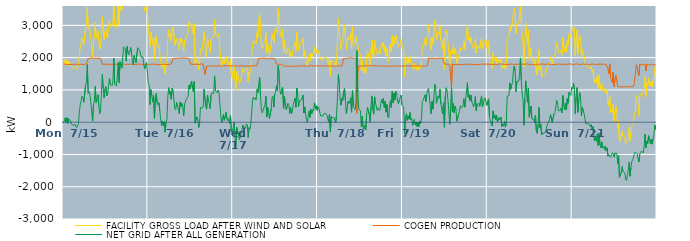
| Category | FACILITY GROSS LOAD AFTER WIND AND SOLAR | COGEN PRODUCTION | NET GRID AFTER ALL GENERATION |
|---|---|---|---|
|  Mon  7/15 | 1766 | 1784 | -18 |
|  Mon  7/15 | 1813 | 1775 | 38 |
|  Mon  7/15 | 1938 | 1803 | 135 |
|  Mon  7/15 | 1782 | 1786 | -4 |
|  Mon  7/15 | 1925 | 1787 | 138 |
|  Mon  7/15 | 1763 | 1802 | -39 |
|  Mon  7/15 | 1895 | 1787 | 108 |
|  Mon  7/15 | 1900 | 1795 | 105 |
|  Mon  7/15 | 1825 | 1789 | 36 |
|  Mon  7/15 | 1742 | 1795 | -53 |
|  Mon  7/15 | 1699 | 1786 | -87 |
|  Mon  7/15 | 1700 | 1796 | -96 |
|  Mon  7/15 | 1693 | 1794 | -101 |
|  Mon  7/15 | 1728 | 1790 | -62 |
|  Mon  7/15 | 1674 | 1797 | -123 |
|  Mon  7/15 | 1626 | 1794 | -168 |
|  Mon  7/15 | 1621 | 1794 | -173 |
|  Mon  7/15 | 1755 | 1796 | -41 |
|  Mon  7/15 | 2092 | 1789 | 303 |
|  Mon  7/15 | 2328 | 1789 | 539 |
|  Mon  7/15 | 2456 | 1795 | 661 |
|  Mon  7/15 | 2601 | 1796 | 805 |
|  Mon  7/15 | 2543 | 1783 | 760 |
|  Mon  7/15 | 2413 | 1793 | 620 |
|  Mon  7/15 | 2430 | 1791 | 639 |
|  Mon  7/15 | 2916 | 1794 | 1122 |
|  Mon  7/15 | 3054 | 1803 | 1251 |
|  Mon  7/15 | 3571 | 1788 | 1783 |
|  Mon  7/15 | 2874 | 1978 | 896 |
|  Mon  7/15 | 2916 | 1974 | 942 |
|  Mon  7/15 | 2829 | 1966 | 863 |
|  Mon  7/15 | 2591 | 1985 | 606 |
|  Mon  7/15 | 2612 | 2004 | 608 |
|  Mon  7/15 | 2009 | 1977 | 32 |
|  Mon  7/15 | 2493 | 1968 | 525 |
|  Mon  7/15 | 2640 | 1972 | 668 |
|  Mon  7/15 | 3095 | 1987 | 1108 |
|  Mon  7/15 | 2599 | 1993 | 606 |
|  Mon  7/15 | 2676 | 1976 | 700 |
|  Mon  7/15 | 2835 | 1985 | 850 |
|  Mon  7/15 | 2508 | 1988 | 520 |
|  Mon  7/15 | 2251 | 1986 | 265 |
|  Mon  7/15 | 2375 | 1973 | 402 |
|  Mon  7/15 | 2881 | 1979 | 902 |
|  Mon  7/15 | 3268 | 1789 | 1479 |
|  Mon  7/15 | 2840 | 1800 | 1040 |
|  Mon  7/15 | 2558 | 1802 | 756 |
|  Mon  7/15 | 2809 | 1787 | 1022 |
|  Mon  7/15 | 2895 | 1789 | 1106 |
|  Mon  7/15 | 2612 | 1795 | 817 |
|  Mon  7/15 | 2690 | 1800 | 890 |
|  Mon  7/15 | 2885 | 1790 | 1095 |
|  Mon  7/15 | 3147 | 1792 | 1355 |
|  Mon  7/15 | 2975 | 1796 | 1179 |
|  Mon  7/15 | 2943 | 1788 | 1155 |
|  Mon  7/15 | 2915 | 1791 | 1124 |
|  Mon  7/15 | 3077 | 1795 | 1282 |
|  Mon  7/15 | 3769 | 1787 | 1982 |
|  Mon  7/15 | 2966 | 1792 | 1174 |
|  Mon  7/15 | 2983 | 1811 | 1172 |
|  Mon  7/15 | 2917 | 1791 | 1126 |
|  Mon  7/15 | 3194 | 1793 | 1401 |
|  Mon  7/15 | 3647 | 1798 | 1849 |
|  Mon  7/15 | 3016 | 1789 | 1227 |
|  Mon  7/15 | 3664 | 1794 | 1870 |
|  Mon  7/15 | 3648 | 1791 | 1857 |
|  Mon  7/15 | 3465 | 1790 | 1675 |
|  Mon  7/15 | 3771 | 1784 | 1987 |
|  Mon  7/15 | 4131 | 1800 | 2331 |
|  Mon  7/15 | 4142 | 1794 | 2348 |
|  Mon  7/15 | 4055 | 1787 | 2268 |
|  Mon  7/15 | 3684 | 1790 | 1894 |
|  Mon  7/15 | 4146 | 1799 | 2347 |
|  Mon  7/15 | 3955 | 1810 | 2145 |
|  Mon  7/15 | 3883 | 1792 | 2091 |
|  Mon  7/15 | 3961 | 1788 | 2173 |
|  Mon  7/15 | 4106 | 1794 | 2312 |
|  Mon  7/15 | 3938 | 1790 | 2148 |
|  Mon  7/15 | 3660 | 1791 | 1869 |
|  Mon  7/15 | 3564 | 1786 | 1778 |
|  Mon  7/15 | 3859 | 1790 | 2069 |
|  Mon  7/15 | 3752 | 1789 | 1963 |
|  Mon  7/15 | 3623 | 1782 | 1841 |
|  Mon  7/15 | 3669 | 1801 | 1868 |
|  Mon  7/15 | 4108 | 1803 | 2305 |
|  Mon  7/15 | 4059 | 1791 | 2268 |
|  Mon  7/15 | 4035 | 1799 | 2236 |
|  Mon  7/15 | 3950 | 1793 | 2157 |
|  Mon  7/15 | 3795 | 1795 | 2000 |
|  Mon  7/15 | 3766 | 1792 | 1974 |
|  Mon  7/15 | 3806 | 1784 | 2022 |
|  Mon  7/15 | 3551 | 1789 | 1762 |
|  Mon  7/15 | 3447 | 1787 | 1660 |
|  Mon  7/15 | 3581 | 1792 | 1789 |
|  Mon  7/15 | 3641 | 1796 | 1845 |
|  Mon  7/15 | 3314 | 1782 | 1532 |
|  Tue  7/16 | 2977 | 1790 | 1187 |
|  Tue  7/16 | 2950 | 1796 | 1154 |
|  Tue  7/16 | 2335 | 1787 | 548 |
|  Tue  7/16 | 2791 | 1781 | 1010 |
|  Tue  7/16 | 2622 | 1802 | 820 |
|  Tue  7/16 | 2415 | 1789 | 626 |
|  Tue  7/16 | 2617 | 1791 | 826 |
|  Tue  7/16 | 1901 | 1792 | 109 |
|  Tue  7/16 | 2542 | 1798 | 744 |
|  Tue  7/16 | 2667 | 1779 | 888 |
|  Tue  7/16 | 2376 | 1785 | 591 |
|  Tue  7/16 | 2325 | 1788 | 537 |
|  Tue  7/16 | 2386 | 1782 | 604 |
|  Tue  7/16 | 2131 | 1786 | 345 |
|  Tue  7/16 | 1881 | 1785 | 96 |
|  Tue  7/16 | 1687 | 1800 | -113 |
|  Tue  7/16 | 1833 | 1794 | 39 |
|  Tue  7/16 | 1694 | 1797 | -103 |
|  Tue  7/16 | 1805 | 1791 | 14 |
|  Tue  7/16 | 1493 | 1803 | -310 |
|  Tue  7/16 | 1767 | 1792 | -25 |
|  Tue  7/16 | 1878 | 1785 | 93 |
|  Tue  7/16 | 2525 | 1783 | 742 |
|  Tue  7/16 | 2865 | 1795 | 1070 |
|  Tue  7/16 | 2663 | 1794 | 869 |
|  Tue  7/16 | 2737 | 1779 | 958 |
|  Tue  7/16 | 2514 | 1802 | 712 |
|  Tue  7/16 | 2850 | 1798 | 1052 |
|  Tue  7/16 | 2941 | 1974 | 967 |
|  Tue  7/16 | 2968 | 1987 | 981 |
|  Tue  7/16 | 2394 | 1976 | 418 |
|  Tue  7/16 | 2368 | 1987 | 381 |
|  Tue  7/16 | 2595 | 1983 | 612 |
|  Tue  7/16 | 2458 | 1984 | 474 |
|  Tue  7/16 | 2424 | 1982 | 442 |
|  Tue  7/16 | 2248 | 1985 | 263 |
|  Tue  7/16 | 2610 | 1984 | 626 |
|  Tue  7/16 | 2456 | 1973 | 483 |
|  Tue  7/16 | 2573 | 1985 | 588 |
|  Tue  7/16 | 2491 | 1990 | 501 |
|  Tue  7/16 | 2193 | 1999 | 194 |
|  Tue  7/16 | 2540 | 1988 | 552 |
|  Tue  7/16 | 2506 | 1981 | 525 |
|  Tue  7/16 | 2691 | 1981 | 710 |
|  Tue  7/16 | 2709 | 1985 | 724 |
|  Tue  7/16 | 2770 | 1981 | 789 |
|  Tue  7/16 | 3119 | 1966 | 1153 |
|  Tue  7/16 | 2996 | 1975 | 1021 |
|  Tue  7/16 | 2995 | 1797 | 1198 |
|  Tue  7/16 | 3059 | 1788 | 1271 |
|  Tue  7/16 | 2838 | 1794 | 1044 |
|  Tue  7/16 | 2726 | 1783 | 943 |
|  Tue  7/16 | 3051 | 1790 | 1261 |
|  Tue  7/16 | 1751 | 1785 | -34 |
|  Tue  7/16 | 1770 | 1797 | -27 |
|  Tue  7/16 | 1965 | 1801 | 164 |
|  Tue  7/16 | 1888 | 1795 | 93 |
|  Tue  7/16 | 1621 | 1791 | -170 |
|  Tue  7/16 | 1750 | 1786 | -36 |
|  Tue  7/16 | 2253 | 1787 | 466 |
|  Tue  7/16 | 2237 | 1805 | 432 |
|  Tue  7/16 | 2241 | 1800 | 441 |
|  Tue  7/16 | 2260 | 1802 | 458 |
|  Tue  7/16 | 2804 | 1782 | 1022 |
|  Tue  7/16 | 2493 | 1482 | 1011 |
|  Tue  7/16 | 2012 | 1511 | 501 |
|  Tue  7/16 | 2140 | 1738 | 402 |
|  Tue  7/16 | 2583 | 1742 | 841 |
|  Tue  7/16 | 2374 | 1738 | 636 |
|  Tue  7/16 | 2318 | 1744 | 574 |
|  Tue  7/16 | 2162 | 1743 | 419 |
|  Tue  7/16 | 2572 | 1739 | 833 |
|  Tue  7/16 | 2656 | 1742 | 914 |
|  Tue  7/16 | 2649 | 1746 | 903 |
|  Tue  7/16 | 2640 | 1746 | 894 |
|  Tue  7/16 | 3179 | 1744 | 1435 |
|  Tue  7/16 | 2703 | 1735 | 968 |
|  Tue  7/16 | 2710 | 1749 | 961 |
|  Tue  7/16 | 2640 | 1725 | 915 |
|  Tue  7/16 | 2756 | 1757 | 999 |
|  Tue  7/16 | 2660 | 1746 | 914 |
|  Tue  7/16 | 2675 | 1740 | 935 |
|  Tue  7/16 | 1937 | 1735 | 202 |
|  Tue  7/16 | 1720 | 1737 | -17 |
|  Tue  7/16 | 1875 | 1754 | 121 |
|  Tue  7/16 | 1987 | 1747 | 240 |
|  Tue  7/16 | 1804 | 1746 | 58 |
|  Tue  7/16 | 1941 | 1746 | 195 |
|  Tue  7/16 | 2047 | 1742 | 305 |
|  Tue  7/16 | 1846 | 1749 | 97 |
|  Tue  7/16 | 1776 | 1737 | 39 |
|  Tue  7/16 | 1859 | 1755 | 104 |
|  Tue  7/16 | 1693 | 1744 | -51 |
|  Tue  7/16 | 1943 | 1741 | 202 |
|  Tue  7/16 | 1469 | 1744 | -275 |
|  Tue  7/16 | 1357 | 1739 | -382 |
|  Wed  7/17 | 1561 | 1743 | -182 |
|  Wed  7/17 | 1752 | 1747 | 5 |
|  Wed  7/17 | 1318 | 1739 | -421 |
|  Wed  7/17 | 970 | 1740 | -770 |
|  Wed  7/17 | 1583 | 1742 | -159 |
|  Wed  7/17 | 1568 | 1751 | -183 |
|  Wed  7/17 | 1350 | 1742 | -392 |
|  Wed  7/17 | 1203 | 1736 | -533 |
|  Wed  7/17 | 1237 | 1750 | -513 |
|  Wed  7/17 | 1385 | 1747 | -362 |
|  Wed  7/17 | 1518 | 1740 | -222 |
|  Wed  7/17 | 1660 | 1749 | -89 |
|  Wed  7/17 | 1540 | 1740 | -200 |
|  Wed  7/17 | 1571 | 1729 | -158 |
|  Wed  7/17 | 1557 | 1746 | -189 |
|  Wed  7/17 | 1690 | 1744 | -54 |
|  Wed  7/17 | 1653 | 1738 | -85 |
|  Wed  7/17 | 1261 | 1735 | -474 |
|  Wed  7/17 | 1566 | 1733 | -167 |
|  Wed  7/17 | 1522 | 1736 | -214 |
|  Wed  7/17 | 1701 | 1751 | -50 |
|  Wed  7/17 | 1715 | 1748 | -33 |
|  Wed  7/17 | 2433 | 1748 | 685 |
|  Wed  7/17 | 2527 | 1752 | 775 |
|  Wed  7/17 | 2460 | 1748 | 712 |
|  Wed  7/17 | 2502 | 1749 | 753 |
|  Wed  7/17 | 2425 | 1729 | 696 |
|  Wed  7/17 | 2768 | 1754 | 1014 |
|  Wed  7/17 | 2653 | 1736 | 917 |
|  Wed  7/17 | 3159 | 1980 | 1179 |
|  Wed  7/17 | 3365 | 1975 | 1390 |
|  Wed  7/17 | 2770 | 1981 | 789 |
|  Wed  7/17 | 2339 | 1983 | 356 |
|  Wed  7/17 | 2268 | 1979 | 289 |
|  Wed  7/17 | 2290 | 1987 | 303 |
|  Wed  7/17 | 2458 | 1990 | 468 |
|  Wed  7/17 | 2504 | 1979 | 525 |
|  Wed  7/17 | 2778 | 1969 | 809 |
|  Wed  7/17 | 2141 | 1983 | 158 |
|  Wed  7/17 | 2424 | 1968 | 456 |
|  Wed  7/17 | 2333 | 1994 | 339 |
|  Wed  7/17 | 2091 | 1980 | 111 |
|  Wed  7/17 | 2092 | 1978 | 114 |
|  Wed  7/17 | 2390 | 1982 | 408 |
|  Wed  7/17 | 2753 | 1991 | 762 |
|  Wed  7/17 | 2781 | 1973 | 808 |
|  Wed  7/17 | 2451 | 1985 | 466 |
|  Wed  7/17 | 2849 | 1975 | 874 |
|  Wed  7/17 | 2890 | 1970 | 920 |
|  Wed  7/17 | 2927 | 1799 | 1128 |
|  Wed  7/17 | 2751 | 1782 | 969 |
|  Wed  7/17 | 3545 | 1795 | 1750 |
|  Wed  7/17 | 3297 | 1804 | 1493 |
|  Wed  7/17 | 2742 | 1795 | 947 |
|  Wed  7/17 | 2658 | 1790 | 868 |
|  Wed  7/17 | 2807 | 1791 | 1016 |
|  Wed  7/17 | 2867 | 1788 | 1079 |
|  Wed  7/17 | 2172 | 1749 | 423 |
|  Wed  7/17 | 2538 | 1737 | 801 |
|  Wed  7/17 | 2247 | 1735 | 512 |
|  Wed  7/17 | 2117 | 1733 | 384 |
|  Wed  7/17 | 2149 | 1737 | 412 |
|  Wed  7/17 | 2317 | 1733 | 584 |
|  Wed  7/17 | 2278 | 1738 | 540 |
|  Wed  7/17 | 2013 | 1743 | 270 |
|  Wed  7/17 | 2187 | 1724 | 463 |
|  Wed  7/17 | 2000 | 1738 | 262 |
|  Wed  7/17 | 2063 | 1736 | 327 |
|  Wed  7/17 | 2307 | 1759 | 548 |
|  Wed  7/17 | 2385 | 1737 | 648 |
|  Wed  7/17 | 2480 | 1740 | 740 |
|  Wed  7/17 | 2196 | 1736 | 460 |
|  Wed  7/17 | 2801 | 1744 | 1057 |
|  Wed  7/17 | 2589 | 1741 | 848 |
|  Wed  7/17 | 2220 | 1736 | 484 |
|  Wed  7/17 | 2399 | 1732 | 667 |
|  Wed  7/17 | 2375 | 1733 | 642 |
|  Wed  7/17 | 2430 | 1739 | 691 |
|  Wed  7/17 | 2488 | 1739 | 749 |
|  Wed  7/17 | 2593 | 1754 | 839 |
|  Wed  7/17 | 2013 | 1729 | 284 |
|  Wed  7/17 | 2216 | 1742 | 474 |
|  Wed  7/17 | 1979 | 1747 | 232 |
|  Wed  7/17 | 1792 | 1734 | 58 |
|  Wed  7/17 | 1735 | 1742 | -7 |
|  Wed  7/17 | 1935 | 1737 | 198 |
|  Wed  7/17 | 2093 | 1743 | 350 |
|  Wed  7/17 | 1892 | 1744 | 148 |
|  Wed  7/17 | 2138 | 1742 | 396 |
|  Wed  7/17 | 2022 | 1755 | 267 |
|  Wed  7/17 | 2130 | 1744 | 386 |
|  Wed  7/17 | 2091 | 1739 | 352 |
|  Wed  7/17 | 2338 | 1739 | 599 |
|  Wed  7/17 | 2157 | 1740 | 417 |
|  Wed  7/17 | 2251 | 1744 | 507 |
|  Wed  7/17 | 2115 | 1749 | 366 |
|  Thu  7/18 | 2224 | 1743 | 481 |
|  Thu  7/18 | 2176 | 1739 | 437 |
|  Thu  7/18 | 2203 | 1750 | 453 |
|  Thu  7/18 | 1934 | 1745 | 189 |
|  Thu  7/18 | 1966 | 1745 | 221 |
|  Thu  7/18 | 1918 | 1739 | 179 |
|  Thu  7/18 | 1904 | 1737 | 167 |
|  Thu  7/18 | 2010 | 1744 | 266 |
|  Thu  7/18 | 2015 | 1730 | 285 |
|  Thu  7/18 | 2008 | 1743 | 265 |
|  Thu  7/18 | 1954 | 1737 | 217 |
|  Thu  7/18 | 1963 | 1749 | 214 |
|  Thu  7/18 | 1739 | 1736 | 3 |
|  Thu  7/18 | 1993 | 1741 | 252 |
|  Thu  7/18 | 1444 | 1750 | -306 |
|  Thu  7/18 | 1919 | 1742 | 177 |
|  Thu  7/18 | 1882 | 1743 | 139 |
|  Thu  7/18 | 1878 | 1738 | 140 |
|  Thu  7/18 | 1894 | 1753 | 141 |
|  Thu  7/18 | 1865 | 1737 | 128 |
|  Thu  7/18 | 1711 | 1734 | -23 |
|  Thu  7/18 | 1962 | 1732 | 230 |
|  Thu  7/18 | 2503 | 1735 | 768 |
|  Thu  7/18 | 3220 | 1747 | 1473 |
|  Thu  7/18 | 2964 | 1753 | 1211 |
|  Thu  7/18 | 2443 | 1740 | 703 |
|  Thu  7/18 | 2258 | 1734 | 524 |
|  Thu  7/18 | 2481 | 1732 | 749 |
|  Thu  7/18 | 2431 | 1756 | 675 |
|  Thu  7/18 | 2947 | 1981 | 966 |
|  Thu  7/18 | 3016 | 1976 | 1040 |
|  Thu  7/18 | 2647 | 1972 | 675 |
|  Thu  7/18 | 2244 | 1979 | 265 |
|  Thu  7/18 | 2431 | 1989 | 442 |
|  Thu  7/18 | 2630 | 1978 | 652 |
|  Thu  7/18 | 2553 | 1973 | 580 |
|  Thu  7/18 | 2614 | 1975 | 639 |
|  Thu  7/18 | 2762 | 2005 | 757 |
|  Thu  7/18 | 2286 | 1978 | 308 |
|  Thu  7/18 | 2974 | 1986 | 988 |
|  Thu  7/18 | 2461 | 1973 | 488 |
|  Thu  7/18 | 2441 | 1982 | 459 |
|  Thu  7/18 | 2367 | 1977 | 390 |
|  Thu  7/18 | 2652 | 1987 | 665 |
|  Thu  7/18 | 2497 | 275 | 2222 |
|  Thu  7/18 | 2425 | 1497 | 928 |
|  Thu  7/18 | 2169 | 1740 | 429 |
|  Thu  7/18 | 2160 | 1740 | 420 |
|  Thu  7/18 | 2096 | 1744 | 352 |
|  Thu  7/18 | 1606 | 1746 | -140 |
|  Thu  7/18 | 1923 | 1733 | 190 |
|  Thu  7/18 | 1591 | 1749 | -158 |
|  Thu  7/18 | 1518 | 1745 | -227 |
|  Thu  7/18 | 1667 | 1752 | -85 |
|  Thu  7/18 | 1511 | 1752 | -241 |
|  Thu  7/18 | 1989 | 1734 | 255 |
|  Thu  7/18 | 2192 | 1736 | 456 |
|  Thu  7/18 | 2173 | 1735 | 438 |
|  Thu  7/18 | 1992 | 1761 | 231 |
|  Thu  7/18 | 1731 | 1731 | 0 |
|  Thu  7/18 | 2252 | 1749 | 503 |
|  Thu  7/18 | 2558 | 1744 | 814 |
|  Thu  7/18 | 2127 | 1744 | 383 |
|  Thu  7/18 | 1997 | 1747 | 250 |
|  Thu  7/18 | 2534 | 1749 | 785 |
|  Thu  7/18 | 2351 | 1750 | 601 |
|  Thu  7/18 | 2356 | 1743 | 613 |
|  Thu  7/18 | 2096 | 1732 | 364 |
|  Thu  7/18 | 2172 | 1730 | 442 |
|  Thu  7/18 | 2204 | 1746 | 458 |
|  Thu  7/18 | 2102 | 1738 | 364 |
|  Thu  7/18 | 2312 | 1731 | 581 |
|  Thu  7/18 | 2450 | 1750 | 700 |
|  Thu  7/18 | 2329 | 1742 | 587 |
|  Thu  7/18 | 2482 | 1741 | 741 |
|  Thu  7/18 | 2189 | 1737 | 452 |
|  Thu  7/18 | 2371 | 1731 | 640 |
|  Thu  7/18 | 2054 | 1746 | 308 |
|  Thu  7/18 | 2281 | 1735 | 546 |
|  Thu  7/18 | 1905 | 1731 | 174 |
|  Thu  7/18 | 1860 | 1735 | 125 |
|  Thu  7/18 | 2297 | 1756 | 541 |
|  Thu  7/18 | 2414 | 1745 | 669 |
|  Thu  7/18 | 2189 | 1736 | 453 |
|  Thu  7/18 | 2691 | 1736 | 955 |
|  Thu  7/18 | 2348 | 1742 | 606 |
|  Thu  7/18 | 2641 | 1738 | 903 |
|  Thu  7/18 | 2425 | 1741 | 684 |
|  Thu  7/18 | 2702 | 1750 | 952 |
|  Thu  7/18 | 2606 | 1745 | 861 |
|  Thu  7/18 | 2393 | 1732 | 661 |
|  Thu  7/18 | 2324 | 1752 | 572 |
|  Thu  7/18 | 2431 | 1734 | 697 |
|  Thu  7/18 | 2398 | 1731 | 667 |
|  Thu  7/18 | 2578 | 1741 | 837 |
|  Thu  7/18 | 2282 | 1747 | 535 |
|  Fri  7/19 | 2246 | 1732 | 514 |
|  Fri  7/19 | 2187 | 1750 | 437 |
|  Fri  7/19 | 1403 | 1746 | -343 |
|  Fri  7/19 | 1895 | 1744 | 151 |
|  Fri  7/19 | 2004 | 1741 | 263 |
|  Fri  7/19 | 1791 | 1733 | 58 |
|  Fri  7/19 | 1947 | 1751 | 196 |
|  Fri  7/19 | 1833 | 1742 | 91 |
|  Fri  7/19 | 2041 | 1743 | 298 |
|  Fri  7/19 | 1829 | 1747 | 82 |
|  Fri  7/19 | 1863 | 1744 | 119 |
|  Fri  7/19 | 1645 | 1745 | -100 |
|  Fri  7/19 | 1772 | 1751 | 21 |
|  Fri  7/19 | 1822 | 1735 | 87 |
|  Fri  7/19 | 1644 | 1734 | -90 |
|  Fri  7/19 | 1749 | 1744 | 5 |
|  Fri  7/19 | 1614 | 1745 | -131 |
|  Fri  7/19 | 1737 | 1741 | -4 |
|  Fri  7/19 | 1613 | 1754 | -141 |
|  Fri  7/19 | 1765 | 1736 | 29 |
|  Fri  7/19 | 1688 | 1734 | -46 |
|  Fri  7/19 | 1858 | 1751 | 107 |
|  Fri  7/19 | 2377 | 1740 | 637 |
|  Fri  7/19 | 2417 | 1737 | 680 |
|  Fri  7/19 | 2382 | 1731 | 651 |
|  Fri  7/19 | 2585 | 1740 | 845 |
|  Fri  7/19 | 2379 | 1742 | 637 |
|  Fri  7/19 | 2599 | 1738 | 861 |
|  Fri  7/19 | 2729 | 1737 | 992 |
|  Fri  7/19 | 3030 | 1988 | 1042 |
|  Fri  7/19 | 2785 | 1974 | 811 |
|  Fri  7/19 | 2445 | 1978 | 467 |
|  Fri  7/19 | 2236 | 1980 | 256 |
|  Fri  7/19 | 2632 | 1986 | 646 |
|  Fri  7/19 | 2406 | 2004 | 402 |
|  Fri  7/19 | 2666 | 1979 | 687 |
|  Fri  7/19 | 3154 | 1976 | 1178 |
|  Fri  7/19 | 3108 | 1965 | 1143 |
|  Fri  7/19 | 2570 | 1988 | 582 |
|  Fri  7/19 | 2750 | 1983 | 767 |
|  Fri  7/19 | 2797 | 1987 | 810 |
|  Fri  7/19 | 2718 | 1981 | 737 |
|  Fri  7/19 | 2990 | 1976 | 1014 |
|  Fri  7/19 | 2543 | 1981 | 562 |
|  Fri  7/19 | 2565 | 1976 | 589 |
|  Fri  7/19 | 2244 | 1982 | 262 |
|  Fri  7/19 | 2598 | 1997 | 601 |
|  Fri  7/19 | 1642 | 1800 | -158 |
|  Fri  7/19 | 2613 | 1796 | 817 |
|  Fri  7/19 | 2864 | 1799 | 1065 |
|  Fri  7/19 | 2741 | 1781 | 960 |
|  Fri  7/19 | 2491 | 1800 | 691 |
|  Fri  7/19 | 2134 | 1792 | 342 |
|  Fri  7/19 | 1735 | 1798 | -63 |
|  Fri  7/19 | 2217 | 1790 | 427 |
|  Fri  7/19 | 2174 | 1091 | 1083 |
|  Fri  7/19 | 2115 | 1790 | 325 |
|  Fri  7/19 | 2378 | 1800 | 578 |
|  Fri  7/19 | 2086 | 1794 | 292 |
|  Fri  7/19 | 2282 | 1785 | 497 |
|  Fri  7/19 | 2206 | 1785 | 421 |
|  Fri  7/19 | 1824 | 1793 | 31 |
|  Fri  7/19 | 1838 | 1793 | 45 |
|  Fri  7/19 | 2029 | 1786 | 243 |
|  Fri  7/19 | 2119 | 1782 | 337 |
|  Fri  7/19 | 2308 | 1798 | 510 |
|  Fri  7/19 | 2238 | 1784 | 454 |
|  Fri  7/19 | 2249 | 1790 | 459 |
|  Fri  7/19 | 2274 | 1790 | 484 |
|  Fri  7/19 | 2520 | 1794 | 726 |
|  Fri  7/19 | 2257 | 1791 | 466 |
|  Fri  7/19 | 2468 | 1789 | 679 |
|  Fri  7/19 | 2463 | 1800 | 663 |
|  Fri  7/19 | 3024 | 1799 | 1225 |
|  Fri  7/19 | 2554 | 1785 | 769 |
|  Fri  7/19 | 2644 | 1793 | 851 |
|  Fri  7/19 | 2472 | 1804 | 668 |
|  Fri  7/19 | 2639 | 1805 | 834 |
|  Fri  7/19 | 2413 | 1783 | 630 |
|  Fri  7/19 | 2439 | 1788 | 651 |
|  Fri  7/19 | 2258 | 1785 | 473 |
|  Fri  7/19 | 2375 | 1800 | 575 |
|  Fri  7/19 | 2581 | 1787 | 794 |
|  Fri  7/19 | 2152 | 1800 | 352 |
|  Fri  7/19 | 2345 | 1791 | 554 |
|  Fri  7/19 | 2341 | 1785 | 556 |
|  Fri  7/19 | 2362 | 1784 | 578 |
|  Fri  7/19 | 2276 | 1784 | 492 |
|  Fri  7/19 | 2492 | 1796 | 696 |
|  Fri  7/19 | 2591 | 1787 | 804 |
|  Fri  7/19 | 2273 | 1798 | 475 |
|  Fri  7/19 | 2321 | 1793 | 528 |
|  Fri  7/19 | 2520 | 1801 | 719 |
|  Fri  7/19 | 2547 | 1788 | 759 |
|  Fri  7/19 | 2551 | 1800 | 751 |
|  Fri  7/19 | 2323 | 1800 | 523 |
|  Sat  7/20 | 2303 | 1797 | 506 |
|  Sat  7/20 | 2520 | 1797 | 723 |
|  Sat  7/20 | 1950 | 1795 | 155 |
|  Sat  7/20 | 1817 | 1784 | 33 |
|  Sat  7/20 | 1852 | 1796 | 56 |
|  Sat  7/20 | 1671 | 1787 | -116 |
|  Sat  7/20 | 2136 | 1785 | 351 |
|  Sat  7/20 | 1926 | 1801 | 125 |
|  Sat  7/20 | 2022 | 1796 | 226 |
|  Sat  7/20 | 1859 | 1790 | 69 |
|  Sat  7/20 | 1998 | 1786 | 212 |
|  Sat  7/20 | 1797 | 1787 | 10 |
|  Sat  7/20 | 1810 | 1796 | 14 |
|  Sat  7/20 | 1943 | 1799 | 144 |
|  Sat  7/20 | 1869 | 1803 | 66 |
|  Sat  7/20 | 1956 | 1801 | 155 |
|  Sat  7/20 | 1666 | 1800 | -134 |
|  Sat  7/20 | 1744 | 1796 | -52 |
|  Sat  7/20 | 1677 | 1798 | -121 |
|  Sat  7/20 | 1823 | 1794 | 29 |
|  Sat  7/20 | 1635 | 1787 | -152 |
|  Sat  7/20 | 1750 | 1790 | -40 |
|  Sat  7/20 | 2599 | 1796 | 803 |
|  Sat  7/20 | 2612 | 1788 | 824 |
|  Sat  7/20 | 2607 | 1788 | 819 |
|  Sat  7/20 | 3010 | 1791 | 1219 |
|  Sat  7/20 | 2819 | 1802 | 1017 |
|  Sat  7/20 | 2934 | 1789 | 1145 |
|  Sat  7/20 | 3026 | 1796 | 1230 |
|  Sat  7/20 | 3399 | 1794 | 1605 |
|  Sat  7/20 | 3519 | 1786 | 1733 |
|  Sat  7/20 | 3377 | 1793 | 1584 |
|  Sat  7/20 | 2734 | 1793 | 941 |
|  Sat  7/20 | 3054 | 1791 | 1263 |
|  Sat  7/20 | 3052 | 1792 | 1260 |
|  Sat  7/20 | 3070 | 1799 | 1271 |
|  Sat  7/20 | 3277 | 1805 | 1472 |
|  Sat  7/20 | 3792 | 1801 | 1991 |
|  Sat  7/20 | 3088 | 1795 | 1293 |
|  Sat  7/20 | 2666 | 1789 | 877 |
|  Sat  7/20 | 2481 | 1796 | 685 |
|  Sat  7/20 | 1705 | 1801 | -96 |
|  Sat  7/20 | 2526 | 1796 | 730 |
|  Sat  7/20 | 3079 | 1799 | 1280 |
|  Sat  7/20 | 2697 | 1809 | 888 |
|  Sat  7/20 | 2401 | 1789 | 612 |
|  Sat  7/20 | 2841 | 1792 | 1049 |
|  Sat  7/20 | 1941 | 1786 | 155 |
|  Sat  7/20 | 1919 | 1791 | 128 |
|  Sat  7/20 | 2291 | 1794 | 497 |
|  Sat  7/20 | 1893 | 1789 | 104 |
|  Sat  7/20 | 1883 | 1795 | 88 |
|  Sat  7/20 | 1861 | 1779 | 82 |
|  Sat  7/20 | 1759 | 1774 | -15 |
|  Sat  7/20 | 2007 | 1786 | 221 |
|  Sat  7/20 | 1522 | 1799 | -277 |
|  Sat  7/20 | 1453 | 1798 | -345 |
|  Sat  7/20 | 1703 | 1790 | -87 |
|  Sat  7/20 | 2248 | 1789 | 459 |
|  Sat  7/20 | 1624 | 1793 | -169 |
|  Sat  7/20 | 1737 | 1802 | -65 |
|  Sat  7/20 | 1403 | 1794 | -391 |
|  Sat  7/20 | 1479 | 1804 | -325 |
|  Sat  7/20 | 1432 | 1793 | -361 |
|  Sat  7/20 | 1418 | 1789 | -371 |
|  Sat  7/20 | 1490 | 1790 | -300 |
|  Sat  7/20 | 1544 | 1793 | -249 |
|  Sat  7/20 | 1689 | 1784 | -95 |
|  Sat  7/20 | 1755 | 1811 | -56 |
|  Sat  7/20 | 1729 | 1792 | -63 |
|  Sat  7/20 | 1874 | 1783 | 91 |
|  Sat  7/20 | 2020 | 1785 | 235 |
|  Sat  7/20 | 2037 | 1795 | 242 |
|  Sat  7/20 | 1779 | 1783 | -4 |
|  Sat  7/20 | 1790 | 1784 | 6 |
|  Sat  7/20 | 2049 | 1785 | 264 |
|  Sat  7/20 | 2081 | 1786 | 295 |
|  Sat  7/20 | 2108 | 1787 | 321 |
|  Sat  7/20 | 2463 | 1794 | 669 |
|  Sat  7/20 | 2335 | 1780 | 555 |
|  Sat  7/20 | 2155 | 1802 | 353 |
|  Sat  7/20 | 2132 | 1801 | 331 |
|  Sat  7/20 | 2160 | 1796 | 364 |
|  Sat  7/20 | 2226 | 1787 | 439 |
|  Sat  7/20 | 2073 | 1783 | 290 |
|  Sat  7/20 | 2613 | 1785 | 828 |
|  Sat  7/20 | 2334 | 1803 | 531 |
|  Sat  7/20 | 2171 | 1792 | 379 |
|  Sat  7/20 | 2377 | 1791 | 586 |
|  Sat  7/20 | 2182 | 1793 | 389 |
|  Sat  7/20 | 2523 | 1794 | 729 |
|  Sat  7/20 | 2376 | 1786 | 590 |
|  Sat  7/20 | 2740 | 1805 | 935 |
|  Sat  7/20 | 2688 | 1799 | 889 |
|  Sat  7/20 | 2634 | 1803 | 831 |
|  Sat  7/20 | 2889 | 1804 | 1085 |
|  Sun  7/21 | 2823 | 1793 | 1030 |
|  Sun  7/21 | 2996 | 1786 | 1210 |
|  Sun  7/21 | 2815 | 1791 | 1024 |
|  Sun  7/21 | 2050 | 1789 | 261 |
|  Sun  7/21 | 2601 | 1805 | 796 |
|  Sun  7/21 | 2864 | 1791 | 1073 |
|  Sun  7/21 | 2105 | 1800 | 305 |
|  Sun  7/21 | 2497 | 1788 | 709 |
|  Sun  7/21 | 2701 | 1783 | 918 |
|  Sun  7/21 | 2546 | 1792 | 754 |
|  Sun  7/21 | 1994 | 1792 | 202 |
|  Sun  7/21 | 2252 | 1788 | 464 |
|  Sun  7/21 | 2158 | 1805 | 353 |
|  Sun  7/21 | 2062 | 1796 | 266 |
|  Sun  7/21 | 1902 | 1789 | 113 |
|  Sun  7/21 | 1736 | 1788 | -52 |
|  Sun  7/21 | 1727 | 1801 | -74 |
|  Sun  7/21 | 1760 | 1798 | -38 |
|  Sun  7/21 | 1717 | 1781 | -64 |
|  Sun  7/21 | 1726 | 1788 | -62 |
|  Sun  7/21 | 1650 | 1792 | -142 |
|  Sun  7/21 | 1724 | 1793 | -69 |
|  Sun  7/21 | 1572 | 1798 | -226 |
|  Sun  7/21 | 1644 | 1779 | -135 |
|  Sun  7/21 | 1331 | 1800 | -469 |
|  Sun  7/21 | 1216 | 1794 | -578 |
|  Sun  7/21 | 1358 | 1785 | -427 |
|  Sun  7/21 | 1209 | 1798 | -589 |
|  Sun  7/21 | 1430 | 1790 | -360 |
|  Sun  7/21 | 1068 | 1788 | -720 |
|  Sun  7/21 | 1450 | 1795 | -345 |
|  Sun  7/21 | 1101 | 1802 | -701 |
|  Sun  7/21 | 995 | 1795 | -800 |
|  Sun  7/21 | 1186 | 1797 | -611 |
|  Sun  7/21 | 1004 | 1801 | -797 |
|  Sun  7/21 | 1035 | 1793 | -758 |
|  Sun  7/21 | 945 | 1790 | -845 |
|  Sun  7/21 | 1052 | 1789 | -737 |
|  Sun  7/21 | 898 | 1790 | -892 |
|  Sun  7/21 | 1001 | 1797 | -796 |
|  Sun  7/21 | 597 | 1655 | -1058 |
|  Sun  7/21 | 500 | 1498 | -998 |
|  Sun  7/21 | 822 | 1805 | -983 |
|  Sun  7/21 | 305 | 1394 | -1089 |
|  Sun  7/21 | 400 | 1413 | -1013 |
|  Sun  7/21 | 282 | 1226 | -944 |
|  Sun  7/21 | 561 | 1552 | -991 |
|  Sun  7/21 | 12 | 1099 | -1087 |
|  Sun  7/21 | 371 | 1328 | -957 |
|  Sun  7/21 | 484 | 1458 | -974 |
|  Sun  7/21 | 316 | 1279 | -963 |
|  Sun  7/21 | -183 | 1103 | -1286 |
|  Sun  7/21 | 66 | 1095 | -1029 |
|  Sun  7/21 | -607 | 1100 | -1707 |
|  Sun  7/21 | -579 | 1098 | -1677 |
|  Sun  7/21 | -465 | 1093 | -1558 |
|  Sun  7/21 | -274 | 1100 | -1374 |
|  Sun  7/21 | -431 | 1096 | -1527 |
|  Sun  7/21 | -396 | 1106 | -1502 |
|  Sun  7/21 | -473 | 1095 | -1568 |
|  Sun  7/21 | -678 | 1083 | -1761 |
|  Sun  7/21 | -704 | 1102 | -1806 |
|  Sun  7/21 | -551 | 1097 | -1648 |
|  Sun  7/21 | -392 | 1105 | -1497 |
|  Sun  7/21 | -150 | 1085 | -1235 |
|  Sun  7/21 | -588 | 1087 | -1675 |
|  Sun  7/21 | -318 | 1096 | -1414 |
|  Sun  7/21 | -124 | 1097 | -1221 |
|  Sun  7/21 | -65 | 1089 | -1154 |
|  Sun  7/21 | 17 | 1104 | -1087 |
|  Sun  7/21 | 258 | 1224 | -966 |
|  Sun  7/21 | 315 | 1235 | -920 |
|  Sun  7/21 | 836 | 1781 | -945 |
|  Sun  7/21 | 758 | 1740 | -982 |
|  Sun  7/21 | 533 | 1518 | -985 |
|  Sun  7/21 | 209 | 1443 | -1234 |
|  Sun  7/21 | 813 | 1805 | -992 |
|  Sun  7/21 | 868 | 1796 | -928 |
|  Sun  7/21 | 882 | 1774 | -892 |
|  Sun  7/21 | 841 | 1762 | -921 |
|  Sun  7/21 | 842 | 1797 | -955 |
|  Sun  7/21 | 1055 | 1798 | -743 |
|  Sun  7/21 | 1410 | 1777 | -367 |
|  Sun  7/21 | 791 | 1590 | -799 |
|  Sun  7/21 | 1211 | 1798 | -587 |
|  Sun  7/21 | 1130 | 1790 | -660 |
|  Sun  7/21 | 1358 | 1776 | -418 |
|  Sun  7/21 | 1255 | 1794 | -539 |
|  Sun  7/21 | 1120 | 1784 | -664 |
|  Sun  7/21 | 1265 | 1796 | -531 |
|  Sun  7/21 | 1091 | 1771 | -680 |
|  Sun  7/21 | 1287 | 1798 | -511 |
|  Sun  7/21 | 1390 | 1785 | -395 |
|  Sun  7/21 | 1712 | 1793 | -81 |
|  Sun  7/21 | 1571 | 1780 | -209 |
|  Sun  7/21 | 1522 | 1796 | -274 |